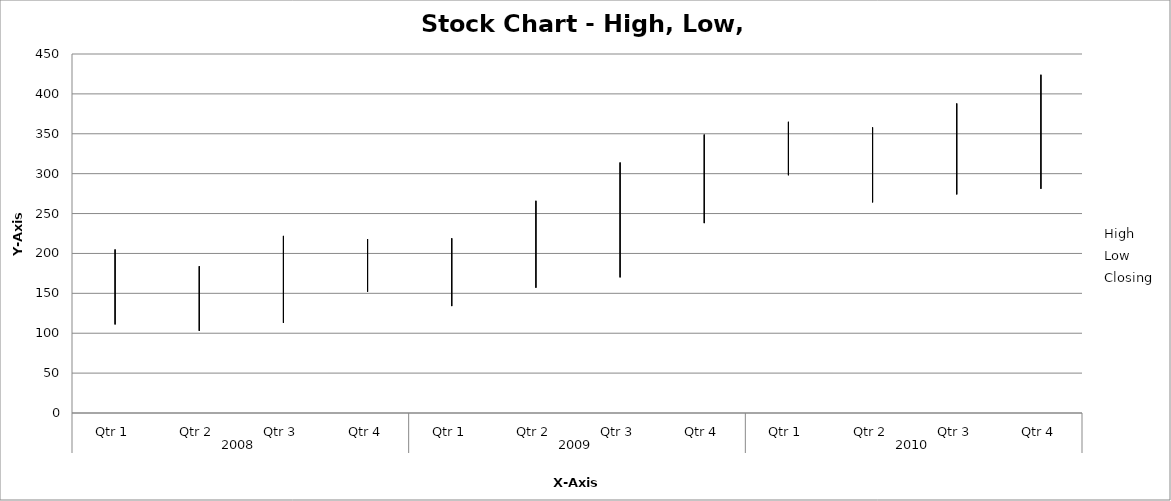
| Category | High | Low | Closing |
|---|---|---|---|
| 0 | 205 | 111 | 150 |
| 1 | 184 | 103 | 151 |
| 2 | 222 | 113 | 195 |
| 3 | 218 | 152 | 181 |
| 4 | 219 | 134 | 190 |
| 5 | 266 | 157 | 201 |
| 6 | 314 | 170 | 275 |
| 7 | 349 | 238 | 345 |
| 8 | 365 | 298 | 299 |
| 9 | 358 | 264 | 314 |
| 10 | 388 | 274 | 327 |
| 11 | 424 | 281 | 412 |